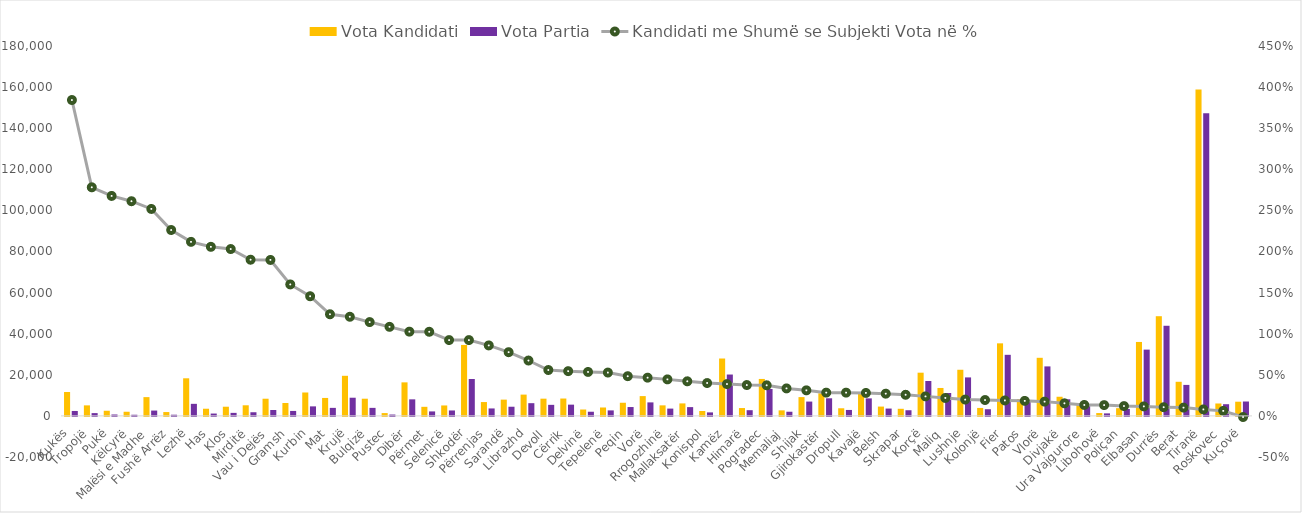
| Category | Vota Kandidati | Vota Partia |
|---|---|---|
| Kukës | 11623 | 2400 |
| Tropojë | 5127 | 1356 |
| Pukë | 2507 | 682 |
| Këlcyrë | 2019 | 559 |
| Malësi e Madhe | 9139 | 2598 |
| Fushë Arrëz | 1872 | 574 |
| Lezhë | 18299 | 5870 |
| Has | 3488 | 1141 |
| Klos | 4466 | 1474 |
| Mirditë | 5165 | 1781 |
| Vau i Dejës | 8359 | 2885 |
| Gramsh | 6270 | 2412 |
| Kurbin | 11390 | 4638 |
| Mat | 8736 | 3906 |
| Krujë | 19513 | 8845 |
| Bulqizë | 8364 | 3906 |
| Pustec | 1373 | 659 |
| Dibër | 16319 | 8059 |
| Përmet | 4417 | 2183 |
| Selenicë | 5083 | 2644 |
| Shkodër | 34531 | 17963 |
| Përrenjas | 6737 | 3627 |
| Sarandë | 7917 | 4460 |
| Librazhd | 10364 | 6192 |
| Devoll | 8383 | 5380 |
| Cërrik | 8454 | 5474 |
| Delvinë | 3108 | 2025 |
| Tepelenë | 4093 | 2680 |
| Peqin | 6400 | 4315 |
| Vorë | 9638 | 6578 |
| Rrogozhinë | 5133 | 3554 |
| Mallaksatër | 6080 | 4279 |
| Konispol | 2388 | 1706 |
| Kamëz | 27926 | 20130 |
| Himarë | 3821 | 2778 |
| Pogradec | 17985 | 13106 |
| Memaliaj | 2701 | 2024 |
| Shijak | 9140 | 6972 |
| Gjirokastër | 10999 | 8572 |
| Dropull | 3712 | 2893 |
| Kavajë | 10914 | 8530 |
| Belsh | 4537 | 3571 |
| Skrapar | 3459 | 2752 |
| Korçë | 21029 | 16993 |
| Maliq | 13592 | 11158 |
| Lushnje | 22453 | 18730 |
| Kolonjë | 3873 | 3246 |
| Fier | 35309 | 29723 |
| Patos | 8218 | 6947 |
| Vlorë | 28271 | 24089 |
| Divjakë | 9319 | 8081 |
| Ura Vajgurore | 5778 | 5099 |
| Libohovë | 1387 | 1226 |
| Poliçan | 3756 | 3355 |
| Elbasan | 35985 | 32255 |
| Durrës | 48512 | 43861 |
| Berat | 16604 | 15081 |
| Tiranë | 158852 | 147267 |
| Roskovec | 6041 | 5693 |
| Kuçovë | 6910 | 7005 |